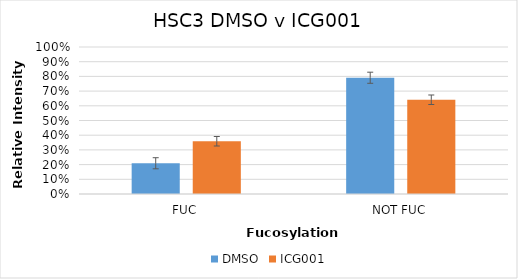
| Category | DMSO | ICG001 |
|---|---|---|
| FUC | 0.209 | 0.359 |
| NOT FUC | 0.791 | 0.641 |